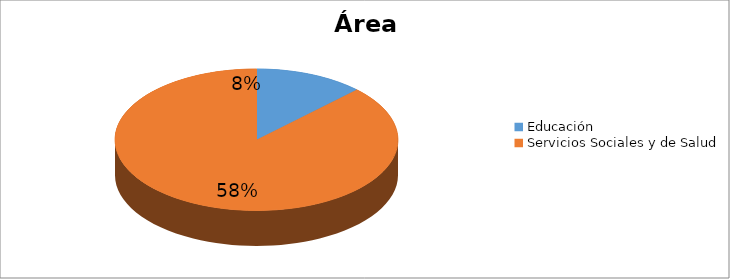
| Category | Series 0 |
|---|---|
| Educación | 0.083 |
| Servicios Sociales y de Salud | 0.583 |